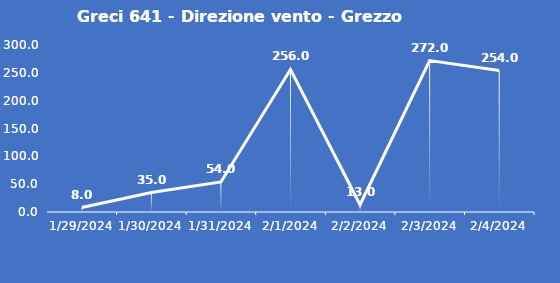
| Category | Greci 641 - Direzione vento - Grezzo (°N) |
|---|---|
| 1/29/24 | 8 |
| 1/30/24 | 35 |
| 1/31/24 | 54 |
| 2/1/24 | 256 |
| 2/2/24 | 13 |
| 2/3/24 | 272 |
| 2/4/24 | 254 |